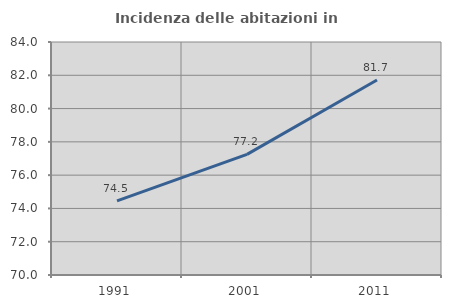
| Category | Incidenza delle abitazioni in proprietà  |
|---|---|
| 1991.0 | 74.459 |
| 2001.0 | 77.249 |
| 2011.0 | 81.718 |